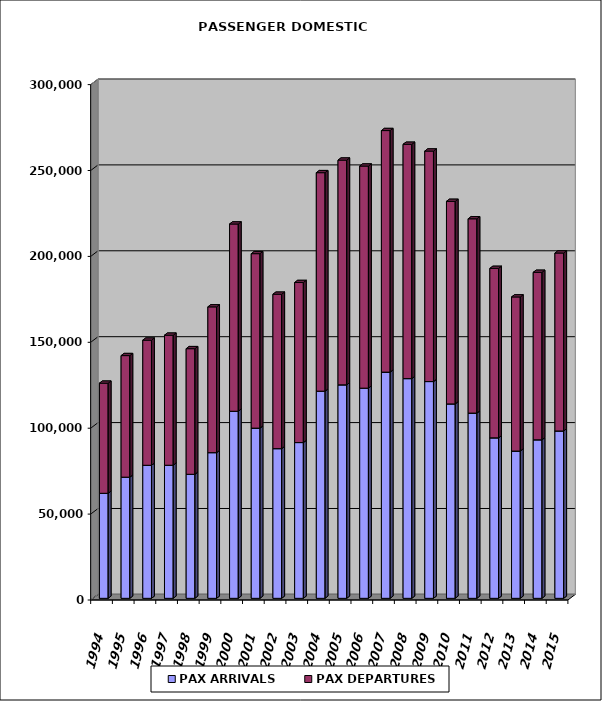
| Category | PAX ARRIVALS | PAX DEPARTURES |
|---|---|---|
| 1994.0 | 61128 | 64087 |
| 1995.0 | 70528 | 70755 |
| 1996.0 | 77442 | 72829 |
| 1997.0 | 77465 | 75686 |
| 1998.0 | 72191 | 73121 |
| 1999.0 | 84803 | 84847 |
| 2000.0 | 108894 | 108982 |
| 2001.0 | 99072 | 101542 |
| 2002.0 | 87132 | 89871 |
| 2003.0 | 90670 | 93151 |
| 2004.0 | 120578 | 127180 |
| 2005.0 | 124263 | 130814 |
| 2006.0 | 122334 | 129276 |
| 2007.0 | 131670 | 140601 |
| 2008.0 | 127889 | 136387 |
| 2009.0 | 126171 | 134176 |
| 2010.0 | 113168 | 117889 |
| 2011.0 | 107819 | 113102 |
| 2012.0 | 93412 | 98631 |
| 2013.0 | 85723 | 89699 |
| 2014.0 | 92265 | 97485 |
| 2015.0 | 97411 | 103589 |